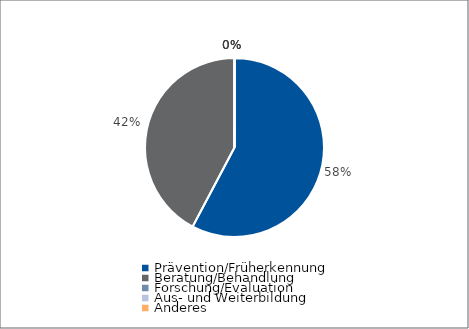
| Category | Series 0 |
|---|---|
| Prävention/Früherkennung | 8200 |
| Beratung/Behandlung | 6000 |
| Forschung/Evaluation | 0 |
| Aus- und Weiterbildung | 0 |
| Anderes | 0 |